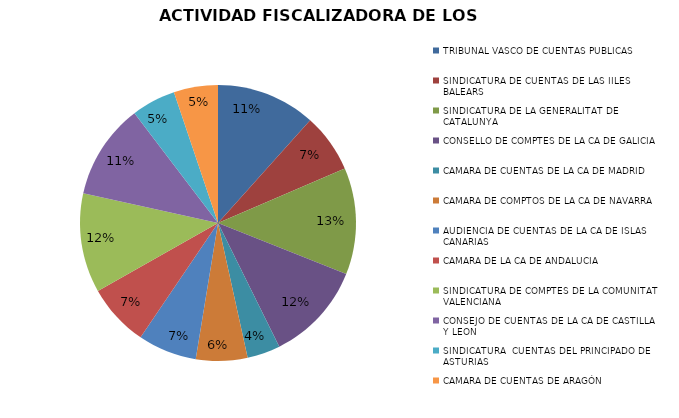
| Category | Series 0 |
|---|---|
| TRIBUNAL VASCO DE CUENTAS PUBLICAS | 27 |
| SINDICATURA DE CUENTAS DE LAS IILES BALEARS | 16 |
| SINDICATURA DE LA GENERALITAT DE CATALUNYA | 29 |
| CONSELLO DE COMPTES DE LA CA DE GALICIA | 27 |
| CAMARA DE CUENTAS DE LA CA DE MADRID | 9 |
| CAMARA DE COMPTOS DE LA CA DE NAVARRA | 14 |
| AUDIENCIA DE CUENTAS DE LA CA DE ISLAS CANARIAS | 16 |
| CAMARA DE LA CA DE ANDALUCIA | 17 |
| SINDICATURA DE COMPTES DE LA COMUNITAT VALENCIANA | 27 |
| CONSEJO DE CUENTAS DE LA CA DE CASTILLA Y LEON | 26 |
| SINDICATURA  CUENTAS DEL PRINCIPADO DE ASTURIAS | 12 |
| CAMARA DE CUENTAS DE ARAGÓN | 12 |